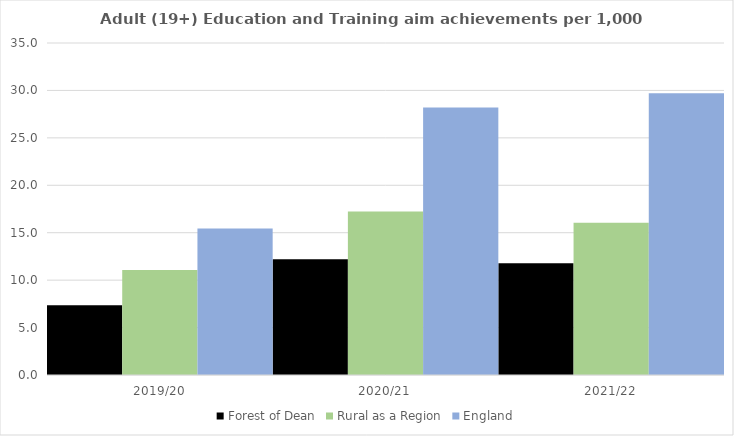
| Category | Forest of Dean | Rural as a Region | England |
|---|---|---|---|
| 2019/20 | 7.35 | 11.081 | 15.446 |
| 2020/21 | 12.196 | 17.224 | 28.211 |
| 2021/22 | 11.771 | 16.063 | 29.711 |